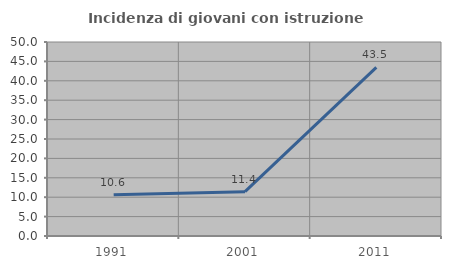
| Category | Incidenza di giovani con istruzione universitaria |
|---|---|
| 1991.0 | 10.638 |
| 2001.0 | 11.429 |
| 2011.0 | 43.478 |